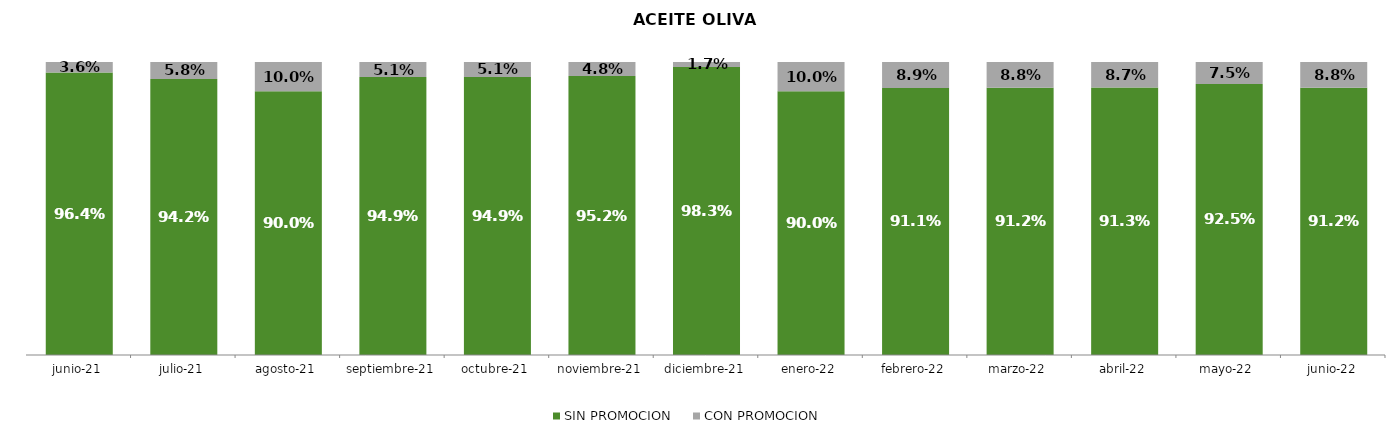
| Category | SIN PROMOCION   | CON PROMOCION   |
|---|---|---|
| 2021-06-01 | 0.964 | 0.036 |
| 2021-07-01 | 0.942 | 0.058 |
| 2021-08-01 | 0.9 | 0.1 |
| 2021-09-01 | 0.949 | 0.051 |
| 2021-10-01 | 0.949 | 0.051 |
| 2021-11-01 | 0.952 | 0.048 |
| 2021-12-01 | 0.983 | 0.017 |
| 2022-01-01 | 0.9 | 0.1 |
| 2022-02-01 | 0.911 | 0.089 |
| 2022-03-01 | 0.912 | 0.088 |
| 2022-04-01 | 0.913 | 0.087 |
| 2022-05-01 | 0.925 | 0.075 |
| 2022-06-01 | 0.912 | 0.088 |